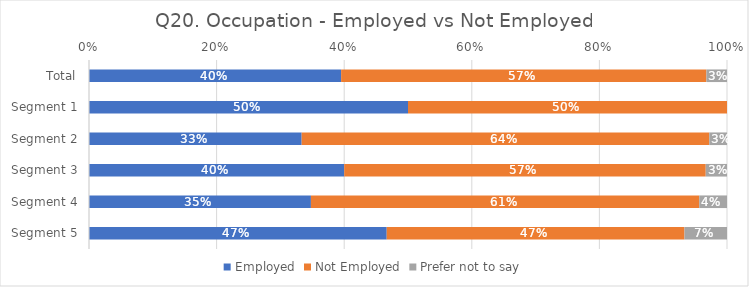
| Category | Employed | Not Employed | Prefer not to say |
|---|---|---|---|
| Total | 0.395 | 0.573 | 0.032 |
| Segment 1 | 0.5 | 0.5 | 0 |
| Segment 2 | 0.333 | 0.639 | 0.028 |
| Segment 3 | 0.4 | 0.567 | 0.033 |
| Segment 4 | 0.348 | 0.609 | 0.043 |
| Segment 5 | 0.467 | 0.467 | 0.067 |